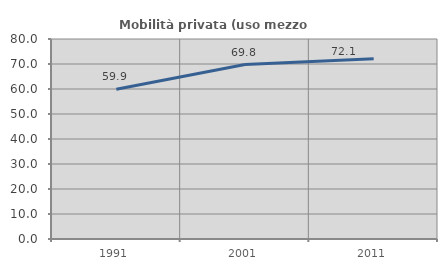
| Category | Mobilità privata (uso mezzo privato) |
|---|---|
| 1991.0 | 59.874 |
| 2001.0 | 69.786 |
| 2011.0 | 72.053 |